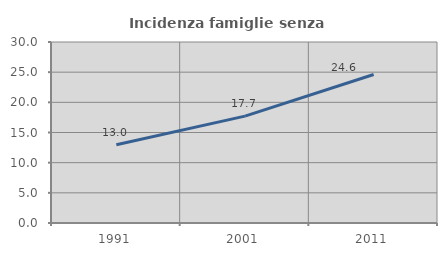
| Category | Incidenza famiglie senza nuclei |
|---|---|
| 1991.0 | 12.977 |
| 2001.0 | 17.718 |
| 2011.0 | 24.613 |